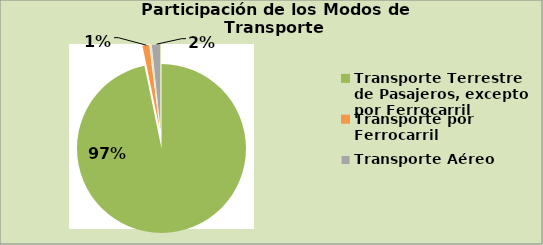
| Category | Series 0 |
|---|---|
| Transporte Terrestre de Pasajeros, excepto por Ferrocarril | 96.766 |
| Transporte por Ferrocarril | 1.293 |
| Transporte por Agua | 0.286 |
| Transporte Aéreo | 1.656 |